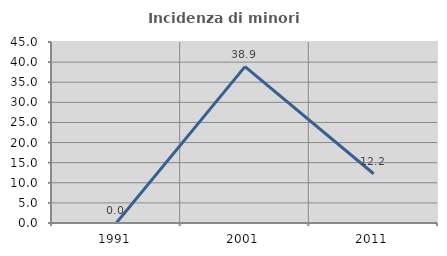
| Category | Incidenza di minori stranieri |
|---|---|
| 1991.0 | 0 |
| 2001.0 | 38.889 |
| 2011.0 | 12.245 |